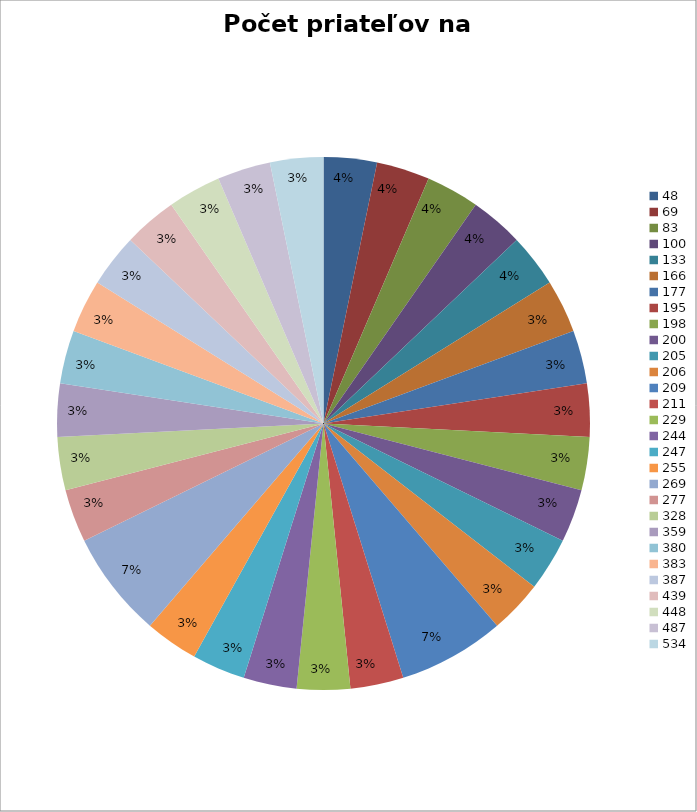
| Category | Series 0 |
|---|---|
| 48.0 | 1 |
| 69.0 | 1 |
| 83.0 | 1 |
| 100.0 | 1 |
| 133.0 | 1 |
| 166.0 | 1 |
| 177.0 | 1 |
| 195.0 | 1 |
| 198.0 | 1 |
| 200.0 | 1 |
| 205.0 | 1 |
| 206.0 | 1 |
| 209.0 | 2 |
| 211.0 | 1 |
| 229.0 | 1 |
| 244.0 | 1 |
| 247.0 | 1 |
| 255.0 | 1 |
| 269.0 | 2 |
| 277.0 | 1 |
| 328.0 | 1 |
| 359.0 | 1 |
| 380.0 | 1 |
| 383.0 | 1 |
| 387.0 | 1 |
| 439.0 | 1 |
| 448.0 | 1 |
| 487.0 | 1 |
| 534.0 | 1 |